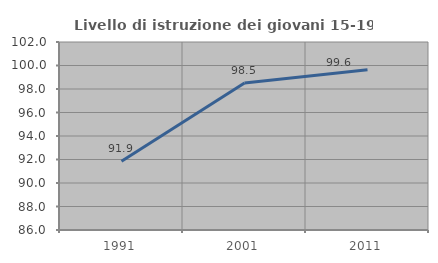
| Category | Livello di istruzione dei giovani 15-19 anni |
|---|---|
| 1991.0 | 91.852 |
| 2001.0 | 98.516 |
| 2011.0 | 99.632 |